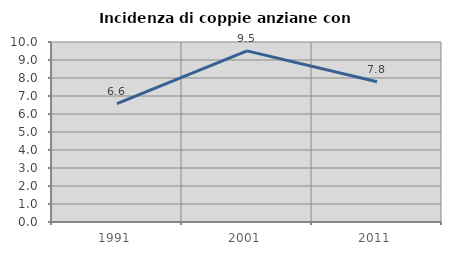
| Category | Incidenza di coppie anziane con figli |
|---|---|
| 1991.0 | 6.574 |
| 2001.0 | 9.506 |
| 2011.0 | 7.792 |